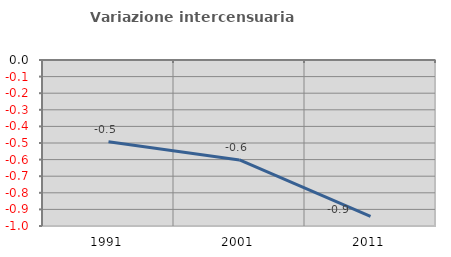
| Category | Variazione intercensuaria annua |
|---|---|
| 1991.0 | -0.492 |
| 2001.0 | -0.602 |
| 2011.0 | -0.943 |